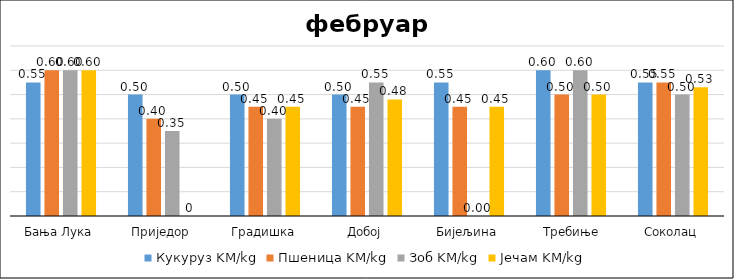
| Category | Кукуруз | Пшеница | Зоб | Јечам |
|---|---|---|---|---|
| Бања Лука | 0.55 | 0.6 | 0.6 | 0.6 |
| Приједор | 0.5 | 0.4 | 0.35 | 0 |
| Градишка | 0.5 | 0.45 | 0.4 | 0.45 |
| Добој | 0.5 | 0.45 | 0.55 | 0.48 |
| Бијељина | 0.55 | 0.45 | 0 | 0.45 |
|  Требиње | 0.6 | 0.5 | 0.6 | 0.5 |
| Соколац | 0.55 | 0.55 | 0.5 | 0.53 |